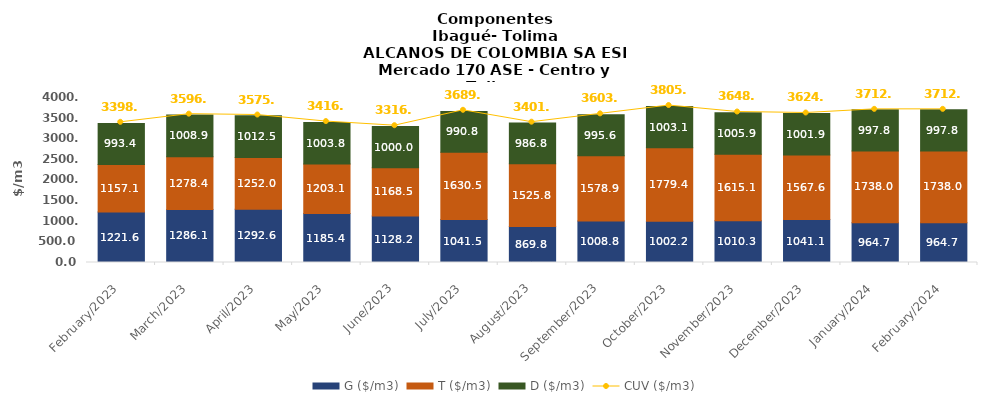
| Category | G ($/m3) | T ($/m3) | D ($/m3) |
|---|---|---|---|
| 2023-02-01 | 1221.59 | 1157.08 | 993.4 |
| 2023-03-01 | 1286.09 | 1278.38 | 1008.86 |
| 2023-04-01 | 1292.6 | 1251.95 | 1012.48 |
| 2023-05-01 | 1185.42 | 1203.07 | 1003.78 |
| 2023-06-01 | 1128.21 | 1168.47 | 999.96 |
| 2023-07-01 | 1041.54 | 1630.51 | 990.77 |
| 2023-08-01 | 869.82 | 1525.81 | 986.78 |
| 2023-09-01 | 1008.82 | 1578.87 | 995.55 |
| 2023-10-01 | 1002.24 | 1779.41 | 1003.05 |
| 2023-11-01 | 1010.34 | 1615.11 | 1005.88 |
| 2023-12-01 | 1041.14 | 1567.6 | 1001.9 |
| 2024-01-01 | 964.66 | 1738.01 | 997.84 |
| 2024-02-01 | 964.66 | 1738.01 | 997.84 |